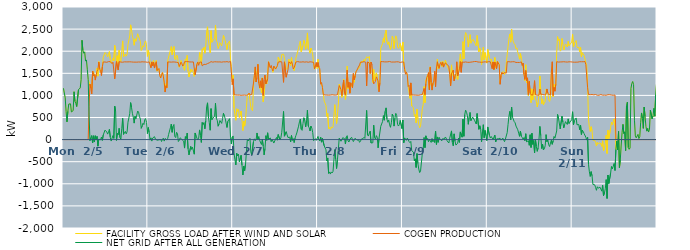
| Category | FACILITY GROSS LOAD AFTER WIND AND SOLAR | COGEN PRODUCTION | NET GRID AFTER ALL GENERATION |
|---|---|---|---|
|  Mon  2/5 | 1161 | 0 | 1161 |
|  Mon  2/5 | 1152 | 0 | 1152 |
|  Mon  2/5 | 944 | 0 | 944 |
|  Mon  2/5 | 638 | 0 | 638 |
|  Mon  2/5 | 402 | 0 | 402 |
|  Mon  2/5 | 640 | 0 | 640 |
|  Mon  2/5 | 804 | 0 | 804 |
|  Mon  2/5 | 790 | 0 | 790 |
|  Mon  2/5 | 809 | 0 | 809 |
|  Mon  2/5 | 626 | 0 | 626 |
|  Mon  2/5 | 626 | 0 | 626 |
|  Mon  2/5 | 656 | 0 | 656 |
|  Mon  2/5 | 1082 | 0 | 1082 |
|  Mon  2/5 | 866 | 0 | 866 |
|  Mon  2/5 | 818 | 0 | 818 |
|  Mon  2/5 | 748 | 0 | 748 |
|  Mon  2/5 | 750 | 0 | 750 |
|  Mon  2/5 | 1128 | 0 | 1128 |
|  Mon  2/5 | 1127 | 0 | 1127 |
|  Mon  2/5 | 1170 | 0 | 1170 |
|  Mon  2/5 | 1357 | 0 | 1357 |
|  Mon  2/5 | 2247 | 0 | 2247 |
|  Mon  2/5 | 2019 | 0 | 2019 |
|  Mon  2/5 | 1954 | 0 | 1954 |
|  Mon  2/5 | 1985 | 0 | 1985 |
|  Mon  2/5 | 1776 | 0 | 1776 |
|  Mon  2/5 | 1802 | 0 | 1802 |
|  Mon  2/5 | 1592 | 0 | 1592 |
|  Mon  2/5 | 1358 | 0 | 1358 |
|  Mon  2/5 | 1307 | 749 | 558 |
|  Mon  2/5 | 1233 | 1257 | -24 |
|  Mon  2/5 | 1205 | 1162 | 43 |
|  Mon  2/5 | 1125 | 1033 | 92 |
|  Mon  2/5 | 1475 | 1551 | -76 |
|  Mon  2/5 | 1535 | 1448 | 87 |
|  Mon  2/5 | 1418 | 1473 | -55 |
|  Mon  2/5 | 1434 | 1346 | 88 |
|  Mon  2/5 | 1453 | 1462 | -9 |
|  Mon  2/5 | 1618 | 1546 | 72 |
|  Mon  2/5 | 1436 | 1585 | -149 |
|  Mon  2/5 | 1764 | 1754 | 10 |
|  Mon  2/5 | 1624 | 1599 | 25 |
|  Mon  2/5 | 1543 | 1549 | -6 |
|  Mon  2/5 | 1508 | 1450 | 58 |
|  Mon  2/5 | 1628 | 1647 | -19 |
|  Mon  2/5 | 1860 | 1757 | 103 |
|  Mon  2/5 | 1876 | 1760 | 116 |
|  Mon  2/5 | 1970 | 1756 | 214 |
|  Mon  2/5 | 1977 | 1751 | 226 |
|  Mon  2/5 | 1922 | 1749 | 173 |
|  Mon  2/5 | 1874 | 1750 | 124 |
|  Mon  2/5 | 1934 | 1764 | 170 |
|  Mon  2/5 | 1992 | 1760 | 232 |
|  Mon  2/5 | 1816 | 1764 | 52 |
|  Mon  2/5 | 1731 | 1764 | -33 |
|  Mon  2/5 | 1749 | 1718 | 31 |
|  Mon  2/5 | 1842 | 1751 | 91 |
|  Mon  2/5 | 1781 | 1754 | 27 |
|  Mon  2/5 | 2131 | 1375 | 756 |
|  Mon  2/5 | 2014 | 1367 | 647 |
|  Mon  2/5 | 1745 | 1764 | -19 |
|  Mon  2/5 | 1898 | 1756 | 142 |
|  Mon  2/5 | 1682 | 1574 | 108 |
|  Mon  2/5 | 2020 | 1764 | 256 |
|  Mon  2/5 | 1801 | 1755 | 46 |
|  Mon  2/5 | 1763 | 1754 | 9 |
|  Mon  2/5 | 2011 | 1755 | 256 |
|  Mon  2/5 | 2233 | 1751 | 482 |
|  Mon  2/5 | 1869 | 1752 | 117 |
|  Mon  2/5 | 1896 | 1759 | 137 |
|  Mon  2/5 | 1937 | 1751 | 186 |
|  Mon  2/5 | 1888 | 1758 | 130 |
|  Mon  2/5 | 1931 | 1755 | 176 |
|  Mon  2/5 | 2151 | 1758 | 393 |
|  Mon  2/5 | 2165 | 1754 | 411 |
|  Mon  2/5 | 2346 | 1760 | 586 |
|  Mon  2/5 | 2596 | 1759 | 837 |
|  Mon  2/5 | 2486 | 1757 | 729 |
|  Mon  2/5 | 2353 | 1758 | 595 |
|  Mon  2/5 | 2262 | 1753 | 509 |
|  Mon  2/5 | 2135 | 1762 | 373 |
|  Mon  2/5 | 2280 | 1753 | 527 |
|  Mon  2/5 | 2225 | 1752 | 473 |
|  Mon  2/5 | 2209 | 1752 | 457 |
|  Mon  2/5 | 2395 | 1749 | 646 |
|  Mon  2/5 | 2378 | 1756 | 622 |
|  Mon  2/5 | 2278 | 1757 | 521 |
|  Mon  2/5 | 2221 | 1754 | 467 |
|  Mon  2/5 | 2018 | 1763 | 255 |
|  Mon  2/5 | 2065 | 1760 | 305 |
|  Mon  2/5 | 2124 | 1754 | 370 |
|  Mon  2/5 | 2097 | 1757 | 340 |
|  Mon  2/5 | 2202 | 1753 | 449 |
|  Mon  2/5 | 2233 | 1757 | 476 |
|  Mon  2/5 | 2144 | 1756 | 388 |
|  Mon  2/5 | 1883 | 1748 | 135 |
|  Tue  2/6 | 2026 | 1753 | 273 |
|  Tue  2/6 | 1920 | 1759 | 161 |
|  Tue  2/6 | 1745 | 1756 | -11 |
|  Tue  2/6 | 1665 | 1626 | 39 |
|  Tue  2/6 | 1724 | 1758 | -34 |
|  Tue  2/6 | 1708 | 1671 | 37 |
|  Tue  2/6 | 1793 | 1747 | 46 |
|  Tue  2/6 | 1685 | 1619 | 66 |
|  Tue  2/6 | 1721 | 1707 | 14 |
|  Tue  2/6 | 1791 | 1760 | 31 |
|  Tue  2/6 | 1548 | 1563 | -15 |
|  Tue  2/6 | 1558 | 1576 | -18 |
|  Tue  2/6 | 1603 | 1608 | -5 |
|  Tue  2/6 | 1461 | 1449 | 12 |
|  Tue  2/6 | 1397 | 1394 | 3 |
|  Tue  2/6 | 1418 | 1462 | -44 |
|  Tue  2/6 | 1523 | 1515 | 8 |
|  Tue  2/6 | 1468 | 1436 | 32 |
|  Tue  2/6 | 1267 | 1301 | -34 |
|  Tue  2/6 | 1101 | 1076 | 25 |
|  Tue  2/6 | 1263 | 1218 | 45 |
|  Tue  2/6 | 1168 | 1176 | -8 |
|  Tue  2/6 | 1787 | 1757 | 30 |
|  Tue  2/6 | 1871 | 1753 | 118 |
|  Tue  2/6 | 1866 | 1756 | 110 |
|  Tue  2/6 | 2026 | 1758 | 268 |
|  Tue  2/6 | 2104 | 1753 | 351 |
|  Tue  2/6 | 1918 | 1753 | 165 |
|  Tue  2/6 | 2059 | 1757 | 302 |
|  Tue  2/6 | 2107 | 1765 | 342 |
|  Tue  2/6 | 1826 | 1755 | 71 |
|  Tue  2/6 | 1802 | 1756 | 46 |
|  Tue  2/6 | 1914 | 1749 | 165 |
|  Tue  2/6 | 1891 | 1756 | 135 |
|  Tue  2/6 | 1697 | 1741 | -44 |
|  Tue  2/6 | 1635 | 1653 | -18 |
|  Tue  2/6 | 1686 | 1645 | 41 |
|  Tue  2/6 | 1788 | 1751 | 37 |
|  Tue  2/6 | 1720 | 1717 | 3 |
|  Tue  2/6 | 1666 | 1664 | 2 |
|  Tue  2/6 | 1659 | 1694 | -35 |
|  Tue  2/6 | 1569 | 1761 | -192 |
|  Tue  2/6 | 1825 | 1759 | 66 |
|  Tue  2/6 | 1789 | 1765 | 24 |
|  Tue  2/6 | 1905 | 1756 | 149 |
|  Tue  2/6 | 1553 | 1763 | -210 |
|  Tue  2/6 | 1415 | 1761 | -346 |
|  Tue  2/6 | 1424 | 1757 | -333 |
|  Tue  2/6 | 1596 | 1753 | -157 |
|  Tue  2/6 | 1536 | 1756 | -220 |
|  Tue  2/6 | 1582 | 1754 | -172 |
|  Tue  2/6 | 1568 | 1757 | -189 |
|  Tue  2/6 | 1431 | 1761 | -330 |
|  Tue  2/6 | 1616 | 1466 | 150 |
|  Tue  2/6 | 1572 | 1485 | 87 |
|  Tue  2/6 | 1733 | 1700 | 33 |
|  Tue  2/6 | 1750 | 1757 | -7 |
|  Tue  2/6 | 1712 | 1681 | 31 |
|  Tue  2/6 | 1969 | 1750 | 219 |
|  Tue  2/6 | 1861 | 1763 | 98 |
|  Tue  2/6 | 1693 | 1757 | -64 |
|  Tue  2/6 | 2054 | 1668 | 386 |
|  Tue  2/6 | 2029 | 1686 | 343 |
|  Tue  2/6 | 2090 | 1703 | 387 |
|  Tue  2/6 | 1954 | 1710 | 244 |
|  Tue  2/6 | 2126 | 1700 | 426 |
|  Tue  2/6 | 2434 | 1694 | 740 |
|  Tue  2/6 | 2552 | 1720 | 832 |
|  Tue  2/6 | 2241 | 1723 | 518 |
|  Tue  2/6 | 2118 | 1737 | 381 |
|  Tue  2/6 | 1963 | 1751 | 212 |
|  Tue  2/6 | 2465 | 1764 | 701 |
|  Tue  2/6 | 2201 | 1751 | 450 |
|  Tue  2/6 | 2236 | 1752 | 484 |
|  Tue  2/6 | 2224 | 1759 | 465 |
|  Tue  2/6 | 2290 | 1761 | 529 |
|  Tue  2/6 | 2588 | 1766 | 822 |
|  Tue  2/6 | 2240 | 1759 | 481 |
|  Tue  2/6 | 2199 | 1762 | 437 |
|  Tue  2/6 | 2060 | 1757 | 303 |
|  Tue  2/6 | 2107 | 1752 | 355 |
|  Tue  2/6 | 2190 | 1758 | 432 |
|  Tue  2/6 | 2161 | 1749 | 412 |
|  Tue  2/6 | 2119 | 1752 | 367 |
|  Tue  2/6 | 2230 | 1753 | 477 |
|  Tue  2/6 | 2356 | 1760 | 596 |
|  Tue  2/6 | 2291 | 1760 | 531 |
|  Tue  2/6 | 2237 | 1758 | 479 |
|  Tue  2/6 | 2218 | 1755 | 463 |
|  Tue  2/6 | 2039 | 1764 | 275 |
|  Tue  2/6 | 2171 | 1757 | 414 |
|  Tue  2/6 | 2151 | 1753 | 398 |
|  Tue  2/6 | 2233 | 1759 | 474 |
|  Tue  2/6 | 1820 | 1769 | 51 |
|  Tue  2/6 | 1655 | 1755 | -100 |
|  Tue  2/6 | 1303 | 1243 | 60 |
|  Wed  2/7 | 1457 | 1374 | 83 |
|  Wed  2/7 | 709 | 1015 | -306 |
|  Wed  2/7 | 561 | 1014 | -453 |
|  Wed  2/7 | 437 | 1010 | -573 |
|  Wed  2/7 | 698 | 1008 | -310 |
|  Wed  2/7 | 639 | 1007 | -368 |
|  Wed  2/7 | 684 | 1014 | -330 |
|  Wed  2/7 | 501 | 1008 | -507 |
|  Wed  2/7 | 496 | 1019 | -523 |
|  Wed  2/7 | 645 | 1001 | -356 |
|  Wed  2/7 | 437 | 1016 | -579 |
|  Wed  2/7 | 205 | 1005 | -800 |
|  Wed  2/7 | 416 | 1017 | -601 |
|  Wed  2/7 | 305 | 1007 | -702 |
|  Wed  2/7 | 460 | 1013 | -553 |
|  Wed  2/7 | 724 | 1002 | -278 |
|  Wed  2/7 | 1000 | 1006 | -6 |
|  Wed  2/7 | 984 | 1015 | -31 |
|  Wed  2/7 | 1053 | 1052 | 1 |
|  Wed  2/7 | 1039 | 1011 | 28 |
|  Wed  2/7 | 737 | 1015 | -278 |
|  Wed  2/7 | 675 | 1019 | -344 |
|  Wed  2/7 | 652 | 1006 | -354 |
|  Wed  2/7 | 1234 | 1280 | -46 |
|  Wed  2/7 | 1461 | 1444 | 17 |
|  Wed  2/7 | 1622 | 1645 | -23 |
|  Wed  2/7 | 1303 | 1303 | 0 |
|  Wed  2/7 | 1552 | 1402 | 150 |
|  Wed  2/7 | 1711 | 1704 | 7 |
|  Wed  2/7 | 1346 | 1279 | 67 |
|  Wed  2/7 | 1156 | 1174 | -18 |
|  Wed  2/7 | 1312 | 1329 | -17 |
|  Wed  2/7 | 1062 | 1173 | -111 |
|  Wed  2/7 | 1399 | 1393 | 6 |
|  Wed  2/7 | 856 | 1002 | -146 |
|  Wed  2/7 | 1007 | 1352 | -345 |
|  Wed  2/7 | 1258 | 1460 | -202 |
|  Wed  2/7 | 1348 | 1260 | 88 |
|  Wed  2/7 | 1258 | 1274 | -16 |
|  Wed  2/7 | 1527 | 1373 | 154 |
|  Wed  2/7 | 1763 | 1759 | 4 |
|  Wed  2/7 | 1670 | 1674 | -4 |
|  Wed  2/7 | 1662 | 1624 | 38 |
|  Wed  2/7 | 1632 | 1679 | -47 |
|  Wed  2/7 | 1599 | 1598 | 1 |
|  Wed  2/7 | 1522 | 1554 | -32 |
|  Wed  2/7 | 1587 | 1665 | -78 |
|  Wed  2/7 | 1649 | 1680 | -31 |
|  Wed  2/7 | 1603 | 1596 | 7 |
|  Wed  2/7 | 1624 | 1576 | 48 |
|  Wed  2/7 | 1659 | 1672 | -13 |
|  Wed  2/7 | 1868 | 1754 | 114 |
|  Wed  2/7 | 1873 | 1745 | 128 |
|  Wed  2/7 | 1755 | 1762 | -7 |
|  Wed  2/7 | 1790 | 1748 | 42 |
|  Wed  2/7 | 1925 | 1759 | 166 |
|  Wed  2/7 | 1915 | 1764 | 151 |
|  Wed  2/7 | 1932 | 1296 | 636 |
|  Wed  2/7 | 1836 | 1759 | 77 |
|  Wed  2/7 | 1814 | 1742 | 72 |
|  Wed  2/7 | 1591 | 1412 | 179 |
|  Wed  2/7 | 1611 | 1501 | 110 |
|  Wed  2/7 | 1623 | 1576 | 47 |
|  Wed  2/7 | 1819 | 1760 | 59 |
|  Wed  2/7 | 1819 | 1764 | 55 |
|  Wed  2/7 | 1667 | 1718 | -51 |
|  Wed  2/7 | 1857 | 1764 | 93 |
|  Wed  2/7 | 1691 | 1709 | -18 |
|  Wed  2/7 | 1621 | 1599 | 22 |
|  Wed  2/7 | 1561 | 1628 | -67 |
|  Wed  2/7 | 1679 | 1646 | 33 |
|  Wed  2/7 | 1848 | 1756 | 92 |
|  Wed  2/7 | 1912 | 1762 | 150 |
|  Wed  2/7 | 1927 | 1765 | 162 |
|  Wed  2/7 | 2070 | 1766 | 304 |
|  Wed  2/7 | 2157 | 1756 | 401 |
|  Wed  2/7 | 2231 | 1766 | 465 |
|  Wed  2/7 | 1988 | 1754 | 234 |
|  Wed  2/7 | 1968 | 1759 | 209 |
|  Wed  2/7 | 2125 | 1760 | 365 |
|  Wed  2/7 | 2246 | 1752 | 494 |
|  Wed  2/7 | 2183 | 1753 | 430 |
|  Wed  2/7 | 2043 | 1758 | 285 |
|  Wed  2/7 | 2184 | 1759 | 425 |
|  Wed  2/7 | 2414 | 1749 | 665 |
|  Wed  2/7 | 2056 | 1750 | 306 |
|  Wed  2/7 | 2023 | 1755 | 268 |
|  Wed  2/7 | 1955 | 1760 | 195 |
|  Wed  2/7 | 2071 | 1764 | 307 |
|  Wed  2/7 | 2015 | 1756 | 259 |
|  Wed  2/7 | 1918 | 1757 | 161 |
|  Wed  2/7 | 1721 | 1746 | -25 |
|  Wed  2/7 | 1593 | 1603 | -10 |
|  Wed  2/7 | 1685 | 1665 | 20 |
|  Wed  2/7 | 1728 | 1745 | -17 |
|  Wed  2/7 | 1607 | 1646 | -39 |
|  Thu  2/8 | 1816 | 1744 | 72 |
|  Thu  2/8 | 1636 | 1637 | -1 |
|  Thu  2/8 | 1573 | 1604 | -31 |
|  Thu  2/8 | 1308 | 1253 | 55 |
|  Thu  2/8 | 1234 | 1292 | -58 |
|  Thu  2/8 | 1207 | 1180 | 27 |
|  Thu  2/8 | 1025 | 1019 | 6 |
|  Thu  2/8 | 871 | 1011 | -140 |
|  Thu  2/8 | 853 | 1009 | -156 |
|  Thu  2/8 | 772 | 1004 | -232 |
|  Thu  2/8 | 525 | 1008 | -483 |
|  Thu  2/8 | 590 | 1005 | -415 |
|  Thu  2/8 | 240 | 1005 | -765 |
|  Thu  2/8 | 278 | 1009 | -731 |
|  Thu  2/8 | 228 | 1008 | -780 |
|  Thu  2/8 | 290 | 1021 | -731 |
|  Thu  2/8 | 261 | 1015 | -754 |
|  Thu  2/8 | 288 | 1006 | -718 |
|  Thu  2/8 | 555 | 1009 | -454 |
|  Thu  2/8 | 790 | 1017 | -227 |
|  Thu  2/8 | 561 | 1007 | -446 |
|  Thu  2/8 | 362 | 1017 | -655 |
|  Thu  2/8 | 567 | 1015 | -448 |
|  Thu  2/8 | 805 | 1018 | -213 |
|  Thu  2/8 | 1256 | 1223 | 33 |
|  Thu  2/8 | 1243 | 1232 | 11 |
|  Thu  2/8 | 1100 | 1137 | -37 |
|  Thu  2/8 | 955 | 1002 | -47 |
|  Thu  2/8 | 1048 | 1005 | 43 |
|  Thu  2/8 | 1367 | 1342 | 25 |
|  Thu  2/8 | 1068 | 1047 | 21 |
|  Thu  2/8 | 907 | 1007 | -100 |
|  Thu  2/8 | 1078 | 1021 | 57 |
|  Thu  2/8 | 1661 | 1572 | 89 |
|  Thu  2/8 | 1151 | 1183 | -32 |
|  Thu  2/8 | 1242 | 1297 | -55 |
|  Thu  2/8 | 1059 | 1049 | 10 |
|  Thu  2/8 | 1279 | 1286 | -7 |
|  Thu  2/8 | 1298 | 1245 | 53 |
|  Thu  2/8 | 1174 | 1174 | 0 |
|  Thu  2/8 | 1450 | 1495 | -45 |
|  Thu  2/8 | 1297 | 1351 | -54 |
|  Thu  2/8 | 1469 | 1438 | 31 |
|  Thu  2/8 | 1545 | 1535 | 10 |
|  Thu  2/8 | 1559 | 1570 | -11 |
|  Thu  2/8 | 1597 | 1616 | -19 |
|  Thu  2/8 | 1607 | 1613 | -6 |
|  Thu  2/8 | 1628 | 1690 | -62 |
|  Thu  2/8 | 1712 | 1751 | -39 |
|  Thu  2/8 | 1767 | 1756 | 11 |
|  Thu  2/8 | 1783 | 1752 | 31 |
|  Thu  2/8 | 1760 | 1737 | 23 |
|  Thu  2/8 | 1814 | 1763 | 51 |
|  Thu  2/8 | 1777 | 1750 | 27 |
|  Thu  2/8 | 1797 | 1749 | 48 |
|  Thu  2/8 | 1874 | 1214 | 660 |
|  Thu  2/8 | 1864 | 1757 | 107 |
|  Thu  2/8 | 1846 | 1766 | 80 |
|  Thu  2/8 | 1882 | 1735 | 147 |
|  Thu  2/8 | 1683 | 1494 | 189 |
|  Thu  2/8 | 1678 | 1755 | -77 |
|  Thu  2/8 | 1627 | 1697 | -70 |
|  Thu  2/8 | 1292 | 1363 | -71 |
|  Thu  2/8 | 1587 | 1261 | 326 |
|  Thu  2/8 | 1334 | 1287 | 47 |
|  Thu  2/8 | 1331 | 1319 | 12 |
|  Thu  2/8 | 1509 | 1419 | 90 |
|  Thu  2/8 | 1433 | 1380 | 53 |
|  Thu  2/8 | 1139 | 1325 | -186 |
|  Thu  2/8 | 1105 | 1081 | 24 |
|  Thu  2/8 | 1298 | 1285 | 13 |
|  Thu  2/8 | 2068 | 1766 | 302 |
|  Thu  2/8 | 2071 | 1761 | 310 |
|  Thu  2/8 | 2171 | 1764 | 407 |
|  Thu  2/8 | 2301 | 1759 | 542 |
|  Thu  2/8 | 2198 | 1759 | 439 |
|  Thu  2/8 | 2397 | 1756 | 641 |
|  Thu  2/8 | 2476 | 1758 | 718 |
|  Thu  2/8 | 2214 | 1752 | 462 |
|  Thu  2/8 | 2152 | 1760 | 392 |
|  Thu  2/8 | 2212 | 1767 | 445 |
|  Thu  2/8 | 2100 | 1767 | 333 |
|  Thu  2/8 | 2038 | 1761 | 277 |
|  Thu  2/8 | 2135 | 1754 | 381 |
|  Thu  2/8 | 2338 | 1759 | 579 |
|  Thu  2/8 | 2284 | 1755 | 529 |
|  Thu  2/8 | 2058 | 1753 | 305 |
|  Thu  2/8 | 2240 | 1755 | 485 |
|  Thu  2/8 | 2347 | 1753 | 594 |
|  Thu  2/8 | 2305 | 1760 | 545 |
|  Thu  2/8 | 2098 | 1754 | 344 |
|  Thu  2/8 | 2066 | 1759 | 307 |
|  Thu  2/8 | 2103 | 1761 | 342 |
|  Thu  2/8 | 2177 | 1744 | 433 |
|  Thu  2/8 | 2164 | 1753 | 411 |
|  Thu  2/8 | 2006 | 1756 | 250 |
|  Fri  2/9 | 2207 | 1764 | 443 |
|  Fri  2/9 | 1684 | 1755 | -71 |
|  Fri  2/9 | 1623 | 1585 | 38 |
|  Fri  2/9 | 1527 | 1479 | 48 |
|  Fri  2/9 | 1515 | 1531 | -16 |
|  Fri  2/9 | 1492 | 1457 | 35 |
|  Fri  2/9 | 1204 | 1201 | 3 |
|  Fri  2/9 | 1183 | 1228 | -45 |
|  Fri  2/9 | 933 | 1001 | -68 |
|  Fri  2/9 | 1242 | 1283 | -41 |
|  Fri  2/9 | 759 | 1008 | -249 |
|  Fri  2/9 | 781 | 1017 | -236 |
|  Fri  2/9 | 723 | 1009 | -286 |
|  Fri  2/9 | 529 | 1013 | -484 |
|  Fri  2/9 | 571 | 1007 | -436 |
|  Fri  2/9 | 375 | 1006 | -631 |
|  Fri  2/9 | 689 | 1005 | -316 |
|  Fri  2/9 | 470 | 1013 | -543 |
|  Fri  2/9 | 336 | 1003 | -667 |
|  Fri  2/9 | 267 | 1013 | -746 |
|  Fri  2/9 | 305 | 1014 | -709 |
|  Fri  2/9 | 312 | 1019 | -707 |
|  Fri  2/9 | 707 | 1019 | -312 |
|  Fri  2/9 | 788 | 1010 | -222 |
|  Fri  2/9 | 1202 | 1155 | 47 |
|  Fri  2/9 | 835 | 1017 | -182 |
|  Fri  2/9 | 1349 | 1264 | 85 |
|  Fri  2/9 | 1393 | 1405 | -12 |
|  Fri  2/9 | 1470 | 1444 | 26 |
|  Fri  2/9 | 1467 | 1516 | -49 |
|  Fri  2/9 | 1134 | 1126 | 8 |
|  Fri  2/9 | 1648 | 1635 | 13 |
|  Fri  2/9 | 1237 | 1301 | -64 |
|  Fri  2/9 | 1142 | 1120 | 22 |
|  Fri  2/9 | 1230 | 1276 | -46 |
|  Fri  2/9 | 1308 | 1323 | -15 |
|  Fri  2/9 | 1481 | 1546 | -65 |
|  Fri  2/9 | 1390 | 1199 | 191 |
|  Fri  2/9 | 1506 | 1616 | -110 |
|  Fri  2/9 | 1820 | 1760 | 60 |
|  Fri  2/9 | 1601 | 1662 | -61 |
|  Fri  2/9 | 1661 | 1611 | 50 |
|  Fri  2/9 | 1720 | 1708 | 12 |
|  Fri  2/9 | 1763 | 1749 | 14 |
|  Fri  2/9 | 1651 | 1679 | -28 |
|  Fri  2/9 | 1771 | 1749 | 22 |
|  Fri  2/9 | 1652 | 1640 | 12 |
|  Fri  2/9 | 1688 | 1679 | 9 |
|  Fri  2/9 | 1794 | 1735 | 59 |
|  Fri  2/9 | 1774 | 1741 | 33 |
|  Fri  2/9 | 1672 | 1699 | -27 |
|  Fri  2/9 | 1689 | 1711 | -22 |
|  Fri  2/9 | 1585 | 1662 | -77 |
|  Fri  2/9 | 1507 | 1475 | 32 |
|  Fri  2/9 | 1243 | 1216 | 27 |
|  Fri  2/9 | 1690 | 1493 | 197 |
|  Fri  2/9 | 1466 | 1528 | -62 |
|  Fri  2/9 | 1433 | 1573 | -140 |
|  Fri  2/9 | 1460 | 1330 | 130 |
|  Fri  2/9 | 1394 | 1427 | -33 |
|  Fri  2/9 | 1370 | 1494 | -124 |
|  Fri  2/9 | 1648 | 1760 | -112 |
|  Fri  2/9 | 1360 | 1442 | -82 |
|  Fri  2/9 | 1553 | 1520 | 33 |
|  Fri  2/9 | 1538 | 1600 | -62 |
|  Fri  2/9 | 1939 | 1765 | 174 |
|  Fri  2/9 | 1695 | 1523 | 172 |
|  Fri  2/9 | 1811 | 1756 | 55 |
|  Fri  2/9 | 2216 | 1753 | 463 |
|  Fri  2/9 | 1825 | 1750 | 75 |
|  Fri  2/9 | 2317 | 1750 | 567 |
|  Fri  2/9 | 2423 | 1757 | 666 |
|  Fri  2/9 | 2382 | 1763 | 619 |
|  Fri  2/9 | 2292 | 1749 | 543 |
|  Fri  2/9 | 2096 | 1750 | 346 |
|  Fri  2/9 | 2253 | 1748 | 505 |
|  Fri  2/9 | 2374 | 1760 | 614 |
|  Fri  2/9 | 2180 | 1753 | 427 |
|  Fri  2/9 | 2192 | 1755 | 437 |
|  Fri  2/9 | 2267 | 1759 | 508 |
|  Fri  2/9 | 2263 | 1755 | 508 |
|  Fri  2/9 | 2205 | 1766 | 439 |
|  Fri  2/9 | 2185 | 1761 | 424 |
|  Fri  2/9 | 2120 | 1767 | 353 |
|  Fri  2/9 | 2356 | 1766 | 590 |
|  Fri  2/9 | 2336 | 1755 | 581 |
|  Fri  2/9 | 1987 | 1754 | 233 |
|  Fri  2/9 | 2066 | 1753 | 313 |
|  Fri  2/9 | 1991 | 1756 | 235 |
|  Fri  2/9 | 1700 | 1749 | -49 |
|  Fri  2/9 | 1926 | 1753 | 173 |
|  Fri  2/9 | 2091 | 1754 | 337 |
|  Fri  2/9 | 1801 | 1760 | 41 |
|  Fri  2/9 | 1966 | 1759 | 207 |
|  Fri  2/9 | 1850 | 1761 | 89 |
|  Fri  2/9 | 1730 | 1753 | -23 |
|  Sat  2/10 | 2042 | 1756 | 286 |
|  Sat  2/10 | 2054 | 1763 | 291 |
|  Sat  2/10 | 1850 | 1760 | 90 |
|  Sat  2/10 | 1795 | 1760 | 35 |
|  Sat  2/10 | 1824 | 1755 | 69 |
|  Sat  2/10 | 1673 | 1605 | 68 |
|  Sat  2/10 | 1759 | 1757 | 2 |
|  Sat  2/10 | 1580 | 1585 | -5 |
|  Sat  2/10 | 1858 | 1756 | 102 |
|  Sat  2/10 | 1625 | 1677 | -52 |
|  Sat  2/10 | 1616 | 1602 | 14 |
|  Sat  2/10 | 1775 | 1765 | 10 |
|  Sat  2/10 | 1782 | 1763 | 19 |
|  Sat  2/10 | 1710 | 1692 | 18 |
|  Sat  2/10 | 1281 | 1251 | 30 |
|  Sat  2/10 | 1442 | 1454 | -12 |
|  Sat  2/10 | 1522 | 1523 | -1 |
|  Sat  2/10 | 1519 | 1484 | 35 |
|  Sat  2/10 | 1535 | 1506 | 29 |
|  Sat  2/10 | 1468 | 1515 | -47 |
|  Sat  2/10 | 1539 | 1526 | 13 |
|  Sat  2/10 | 1532 | 1504 | 28 |
|  Sat  2/10 | 1919 | 1762 | 157 |
|  Sat  2/10 | 2103 | 1759 | 344 |
|  Sat  2/10 | 2291 | 1762 | 529 |
|  Sat  2/10 | 2390 | 1752 | 638 |
|  Sat  2/10 | 2204 | 1757 | 447 |
|  Sat  2/10 | 2495 | 1759 | 736 |
|  Sat  2/10 | 2272 | 1762 | 510 |
|  Sat  2/10 | 2288 | 1764 | 524 |
|  Sat  2/10 | 2167 | 1762 | 405 |
|  Sat  2/10 | 2143 | 1763 | 380 |
|  Sat  2/10 | 2052 | 1746 | 306 |
|  Sat  2/10 | 2075 | 1758 | 317 |
|  Sat  2/10 | 1968 | 1746 | 222 |
|  Sat  2/10 | 1905 | 1760 | 145 |
|  Sat  2/10 | 1819 | 1745 | 74 |
|  Sat  2/10 | 1945 | 1755 | 190 |
|  Sat  2/10 | 1835 | 1758 | 77 |
|  Sat  2/10 | 1723 | 1675 | 48 |
|  Sat  2/10 | 1743 | 1732 | 11 |
|  Sat  2/10 | 1520 | 1474 | 46 |
|  Sat  2/10 | 1335 | 1361 | -26 |
|  Sat  2/10 | 1694 | 1562 | 132 |
|  Sat  2/10 | 1285 | 1334 | -49 |
|  Sat  2/10 | 1364 | 1397 | -33 |
|  Sat  2/10 | 993 | 1017 | -24 |
|  Sat  2/10 | 1189 | 1318 | -129 |
|  Sat  2/10 | 1160 | 1050 | 110 |
|  Sat  2/10 | 835 | 1014 | -179 |
|  Sat  2/10 | 1149 | 1005 | 144 |
|  Sat  2/10 | 900 | 1009 | -109 |
|  Sat  2/10 | 1128 | 1148 | -20 |
|  Sat  2/10 | 1033 | 1333 | -300 |
|  Sat  2/10 | 1011 | 1016 | -5 |
|  Sat  2/10 | 860 | 1015 | -155 |
|  Sat  2/10 | 738 | 1004 | -266 |
|  Sat  2/10 | 832 | 1017 | -185 |
|  Sat  2/10 | 1016 | 1005 | 11 |
|  Sat  2/10 | 1440 | 1142 | 298 |
|  Sat  2/10 | 1117 | 1027 | 90 |
|  Sat  2/10 | 813 | 1015 | -202 |
|  Sat  2/10 | 920 | 1021 | -101 |
|  Sat  2/10 | 787 | 1020 | -233 |
|  Sat  2/10 | 801 | 1011 | -210 |
|  Sat  2/10 | 864 | 1004 | -140 |
|  Sat  2/10 | 1145 | 1033 | 112 |
|  Sat  2/10 | 1096 | 1146 | -50 |
|  Sat  2/10 | 1047 | 1055 | -8 |
|  Sat  2/10 | 898 | 1016 | -118 |
|  Sat  2/10 | 861 | 1018 | -157 |
|  Sat  2/10 | 936 | 1013 | -77 |
|  Sat  2/10 | 1516 | 1529 | -13 |
|  Sat  2/10 | 1655 | 1761 | -106 |
|  Sat  2/10 | 972 | 1002 | -30 |
|  Sat  2/10 | 1252 | 1181 | 71 |
|  Sat  2/10 | 1127 | 1095 | 32 |
|  Sat  2/10 | 1261 | 1250 | 11 |
|  Sat  2/10 | 1958 | 1763 | 195 |
|  Sat  2/10 | 2330 | 1760 | 570 |
|  Sat  2/10 | 2242 | 1754 | 488 |
|  Sat  2/10 | 2275 | 1766 | 509 |
|  Sat  2/10 | 2000 | 1757 | 243 |
|  Sat  2/10 | 2026 | 1765 | 261 |
|  Sat  2/10 | 2287 | 1758 | 529 |
|  Sat  2/10 | 2155 | 1758 | 397 |
|  Sat  2/10 | 2027 | 1762 | 265 |
|  Sat  2/10 | 2105 | 1763 | 342 |
|  Sat  2/10 | 2163 | 1757 | 406 |
|  Sat  2/10 | 2138 | 1763 | 375 |
|  Sat  2/10 | 2096 | 1754 | 342 |
|  Sat  2/10 | 2224 | 1755 | 469 |
|  Sat  2/10 | 2123 | 1760 | 363 |
|  Sat  2/10 | 2152 | 1756 | 396 |
|  Sat  2/10 | 2148 | 1759 | 389 |
|  Sat  2/10 | 2206 | 1758 | 448 |
|  Sun  2/11 | 2384 | 1754 | 630 |
|  Sun  2/11 | 2094 | 1759 | 335 |
|  Sun  2/11 | 2181 | 1751 | 430 |
|  Sun  2/11 | 2179 | 1754 | 425 |
|  Sun  2/11 | 2242 | 1752 | 490 |
|  Sun  2/11 | 2097 | 1762 | 335 |
|  Sun  2/11 | 2072 | 1753 | 319 |
|  Sun  2/11 | 2097 | 1756 | 341 |
|  Sun  2/11 | 1986 | 1762 | 224 |
|  Sun  2/11 | 2092 | 1764 | 328 |
|  Sun  2/11 | 1876 | 1762 | 114 |
|  Sun  2/11 | 1966 | 1752 | 214 |
|  Sun  2/11 | 1945 | 1761 | 184 |
|  Sun  2/11 | 1903 | 1766 | 137 |
|  Sun  2/11 | 1902 | 1767 | 135 |
|  Sun  2/11 | 1749 | 1695 | 54 |
|  Sun  2/11 | 1677 | 1688 | -11 |
|  Sun  2/11 | 1224 | 1171 | 53 |
|  Sun  2/11 | 462 | 1020 | -558 |
|  Sun  2/11 | 275 | 1004 | -729 |
|  Sun  2/11 | 183 | 1016 | -833 |
|  Sun  2/11 | 292 | 1017 | -725 |
|  Sun  2/11 | 200 | 1019 | -819 |
|  Sun  2/11 | -15 | 1000 | -1015 |
|  Sun  2/11 | -8 | 1012 | -1020 |
|  Sun  2/11 | -14 | 1008 | -1022 |
|  Sun  2/11 | -61 | 1019 | -1080 |
|  Sun  2/11 | -146 | 1001 | -1147 |
|  Sun  2/11 | -64 | 1003 | -1067 |
|  Sun  2/11 | -96 | 1003 | -1099 |
|  Sun  2/11 | -109 | 1004 | -1113 |
|  Sun  2/11 | -72 | 1004 | -1076 |
|  Sun  2/11 | -99 | 1019 | -1118 |
|  Sun  2/11 | -152 | 1015 | -1167 |
|  Sun  2/11 | -27 | 1005 | -1032 |
|  Sun  2/11 | -253 | 1016 | -1269 |
|  Sun  2/11 | -202 | 1006 | -1208 |
|  Sun  2/11 | -94 | 1019 | -1113 |
|  Sun  2/11 | 98 | 1003 | -905 |
|  Sun  2/11 | -315 | 1017 | -1332 |
|  Sun  2/11 | 214 | 1015 | -801 |
|  Sun  2/11 | 23 | 1018 | -995 |
|  Sun  2/11 | 28 | 1015 | -987 |
|  Sun  2/11 | 260 | 1020 | -760 |
|  Sun  2/11 | 398 | 1008 | -610 |
|  Sun  2/11 | 340 | 1001 | -661 |
|  Sun  2/11 | 355 | 1003 | -648 |
|  Sun  2/11 | 468 | 1010 | -542 |
|  Sun  2/11 | 311 | 1009 | -698 |
|  Sun  2/11 | -223 | 0 | -223 |
|  Sun  2/11 | -32 | 0 | -32 |
|  Sun  2/11 | -235 | 0 | -235 |
|  Sun  2/11 | 183 | 0 | 183 |
|  Sun  2/11 | -634 | 0 | -634 |
|  Sun  2/11 | -447 | 0 | -447 |
|  Sun  2/11 | -122 | 0 | -122 |
|  Sun  2/11 | 164 | 0 | 164 |
|  Sun  2/11 | 344 | 0 | 344 |
|  Sun  2/11 | 136 | 0 | 136 |
|  Sun  2/11 | 175 | 0 | 175 |
|  Sun  2/11 | -247 | 0 | -247 |
|  Sun  2/11 | 770 | 0 | 770 |
|  Sun  2/11 | 848 | 0 | 848 |
|  Sun  2/11 | -179 | 0 | -179 |
|  Sun  2/11 | -219 | 0 | -219 |
|  Sun  2/11 | -189 | 0 | -189 |
|  Sun  2/11 | 1155 | 0 | 1155 |
|  Sun  2/11 | 1269 | 0 | 1269 |
|  Sun  2/11 | 1314 | 0 | 1314 |
|  Sun  2/11 | 1244 | 0 | 1244 |
|  Sun  2/11 | 440 | 0 | 440 |
|  Sun  2/11 | 83 | 0 | 83 |
|  Sun  2/11 | 40 | 0 | 40 |
|  Sun  2/11 | 55 | 0 | 55 |
|  Sun  2/11 | 118 | 0 | 118 |
|  Sun  2/11 | 24 | 0 | 24 |
|  Sun  2/11 | 66 | 0 | 66 |
|  Sun  2/11 | 381 | 0 | 381 |
|  Sun  2/11 | 603 | 0 | 603 |
|  Sun  2/11 | 483 | 0 | 483 |
|  Sun  2/11 | 254 | 0 | 254 |
|  Sun  2/11 | 736 | 0 | 736 |
|  Sun  2/11 | 522 | 0 | 522 |
|  Sun  2/11 | 295 | 0 | 295 |
|  Sun  2/11 | 192 | 0 | 192 |
|  Sun  2/11 | 253 | 0 | 253 |
|  Sun  2/11 | 171 | 0 | 171 |
|  Sun  2/11 | 238 | 0 | 238 |
|  Sun  2/11 | 666 | 0 | 666 |
|  Sun  2/11 | 657 | 0 | 657 |
|  Sun  2/11 | 470 | 0 | 470 |
|  Sun  2/11 | 536 | 0 | 536 |
|  Sun  2/11 | 707 | 0 | 707 |
|  Sun  2/11 | 530 | 0 | 530 |
|  Sun  2/11 | 1009 | 0 | 1009 |
|  Sun  2/11 | 1275 | 0 | 1275 |